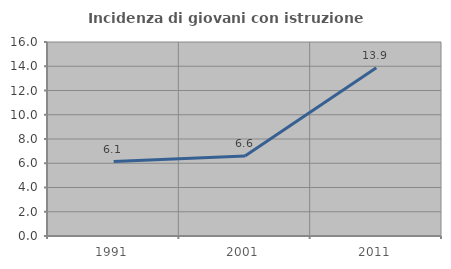
| Category | Incidenza di giovani con istruzione universitaria |
|---|---|
| 1991.0 | 6.138 |
| 2001.0 | 6.595 |
| 2011.0 | 13.883 |